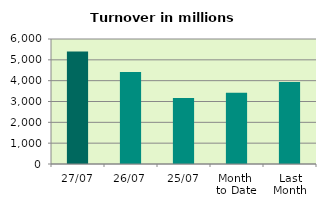
| Category | Series 0 |
|---|---|
| 27/07 | 5404.672 |
| 26/07 | 4417.741 |
| 25/07 | 3171.663 |
| Month 
to Date | 3418.895 |
| Last
Month | 3940.311 |